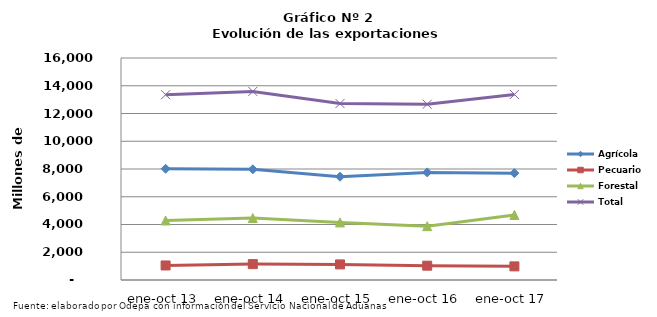
| Category | Agrícola | Pecuario | Forestal | Total |
|---|---|---|---|---|
| ene-oct 13 | 8015924 | 1047609 | 4290847 | 13354380 |
| ene-oct 14 | 7977289 | 1145844 | 4468412 | 13591545 |
| ene-oct 15 | 7442690 | 1123350 | 4151614 | 12717654 |
| ene-oct 16 | 7755749 | 1032546 | 3879883 | 12668178 |
| ene-oct 17 | 7700678 | 982126 | 4690397 | 13373201 |